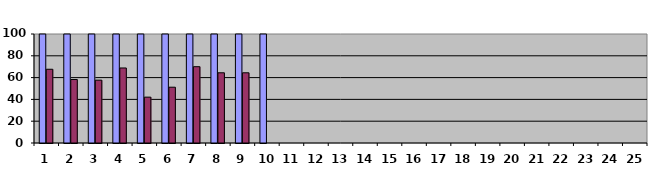
| Category | SORUNUN DEĞER | CEVAPLAMA ORANI |
|---|---|---|
| 1.0 | 100 | 67.647 |
| 2.0 | 100 | 58.235 |
| 3.0 | 100 | 57.647 |
| 4.0 | 100 | 68.824 |
| 5.0 | 100 | 42.059 |
| 6.0 | 100 | 51.176 |
| 7.0 | 100 | 70 |
| 8.0 | 100 | 64.412 |
| 9.0 | 100 | 64.412 |
| 10.0 | 100 | 0 |
| 11.0 | 0 | 0 |
| 12.0 | 0 | 0 |
| 13.0 | 0 | 0 |
| 14.0 | 0 | 0 |
| 15.0 | 0 | 0 |
| 16.0 | 0 | 0 |
| 17.0 | 0 | 0 |
| 18.0 | 0 | 0 |
| 19.0 | 0 | 0 |
| 20.0 | 0 | 0 |
| 21.0 | 0 | 0 |
| 22.0 | 0 | 0 |
| 23.0 | 0 | 0 |
| 24.0 | 0 | 0 |
| 25.0 | 0 | 0 |